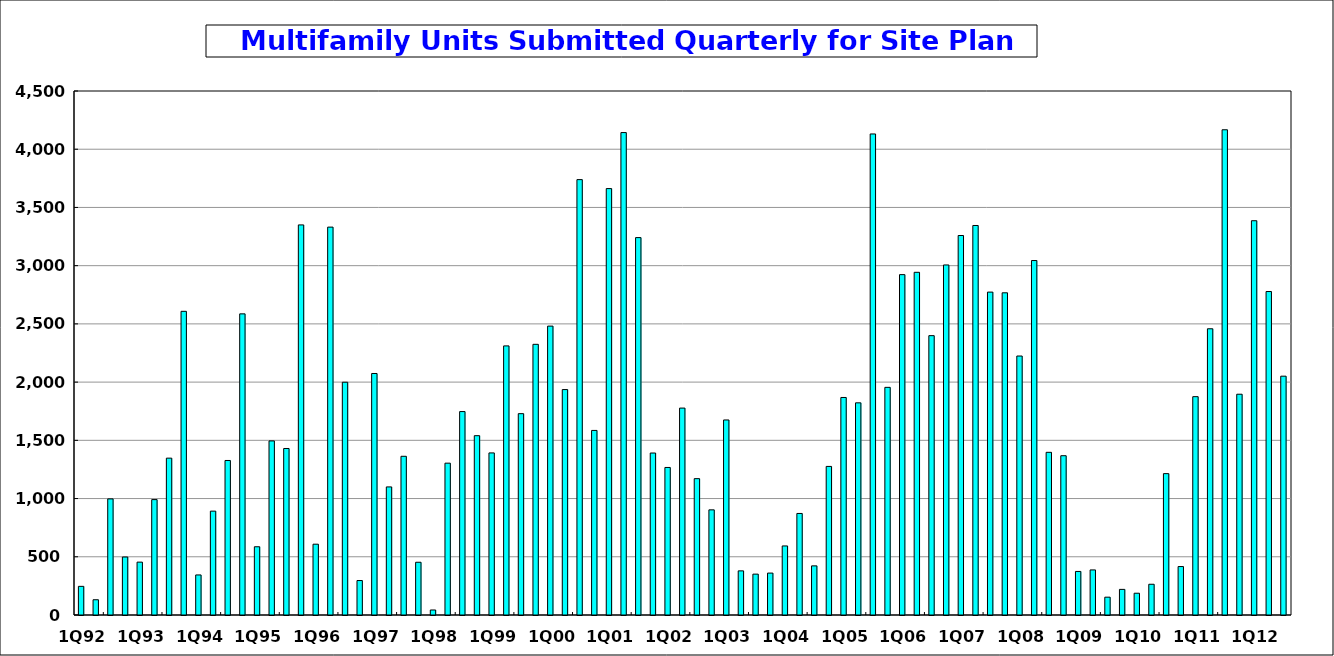
| Category | Series 0 |
|---|---|
| 1Q92 | 246 |
| 2Q92 | 131 |
| 3Q92 | 997 |
| 4Q92 | 498 |
| 1Q93 | 454 |
| 2Q93 | 991 |
| 3Q93 | 1347 |
| 4Q93 | 2608 |
| 1Q94 | 344 |
| 2Q94 | 892 |
| 3Q94 | 1327 |
| 4Q94 | 2586 |
| 1Q95 | 586 |
| 2Q95 | 1495 |
| 3Q95 | 1430 |
| 4Q95 | 3350 |
| 1Q96 | 608 |
| 2Q96 | 3331 |
| 3Q96 | 1999 |
| 4Q96 | 296 |
| 1Q97 | 2074 |
| 2Q97 | 1100 |
| 3Q97 | 1363 |
| 4Q97 | 453 |
| 1Q98 | 43 |
| 2Q98 | 1304 |
| 3Q98 | 1747 |
| 4Q98 | 1540 |
| 1Q99 | 1392 |
| 2Q99 | 2311 |
| 3Q99 | 1729 |
| 4Q99 | 2324.56 |
| 1Q00 | 2481 |
| 2Q00 | 1936 |
| 3Q00 | 3739 |
| 4Q00 | 1585 |
| 1Q01 | 3662 |
| 2Q01 | 4143 |
| 3Q01 | 3241 |
| 4Q01 | 1391 |
| 1Q02 | 1267 |
| 2Q02 | 1777 |
| 3Q02 | 1171 |
| 4Q02 | 903 |
| 1Q03 | 1675 |
| 2Q03 | 379 |
| 3Q03 | 351 |
| 4Q03 | 360 |
| 1Q04 | 593 |
| 2Q04 | 872 |
| 3Q04 | 422 |
| 4Q04 | 1276 |
| 1Q05 | 1868 |
| 2Q05 | 1822 |
| 3Q05 | 4131 |
| 4Q05 | 1955 |
| 1Q06 | 2923 |
| 2Q06 | 2943 |
| 3Q06 | 2399 |
| 4Q06 | 3006 |
| 1Q07 | 3259 |
| 2Q07 | 3345 |
| 3Q07 | 2773 |
| 4Q07 | 2767 |
| 1Q08 | 2224 |
| 2Q08 | 3044 |
| 3Q08 | 1397 |
| 4Q08 | 1368 |
| 1Q09 | 374 |
| 2Q09 | 387 |
| 3Q09 | 153 |
| 4Q09 | 220 |
| 1Q10 | 187 |
| 2Q10 | 264 |
| 3Q10 | 1214 |
| 4Q10 | 416 |
| 1Q11 | 1875 |
| 2Q11 | 2458 |
| 3Q11 | 4167 |
| 4Q11 | 1896 |
| 1Q12 | 3386 |
| 2Q12 | 2778 |
| 3Q12 | 2051 |